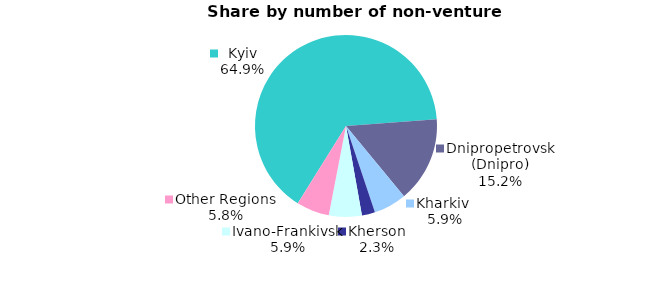
| Category | Series 0 |
|---|---|
| Kyiv | 0.649 |
| Dnipropetrovsk (Dnipro) | 0.152 |
| Kharkiv  | 0.058 |
| Kherson | 0.023 |
| Ivano-Frankivsk | 0.058 |
| Other Regions | 0.058 |